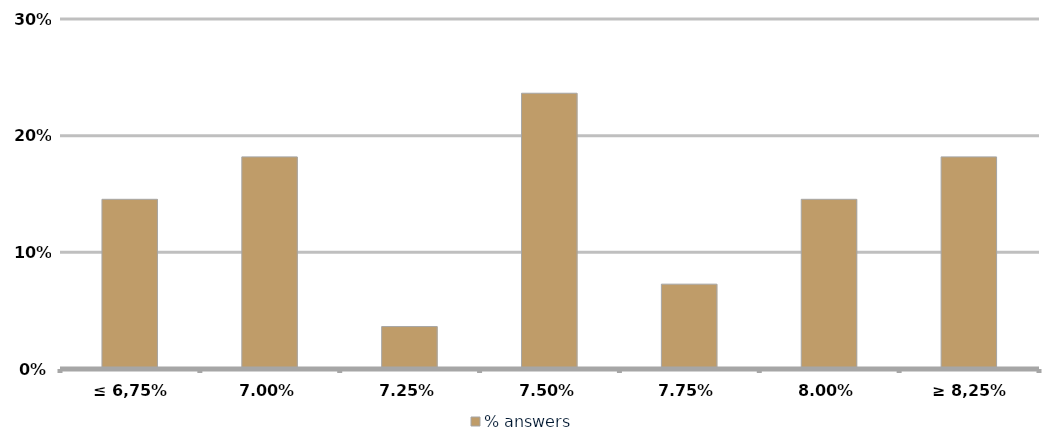
| Category | % answers |
|---|---|
| ≤ 6,75% | 0.145 |
| 7,00% | 0.182 |
| 7,25% | 0.036 |
| 7,50% | 0.236 |
| 7,75% | 0.073 |
| 8,00% | 0.145 |
| ≥ 8,25% | 0.182 |